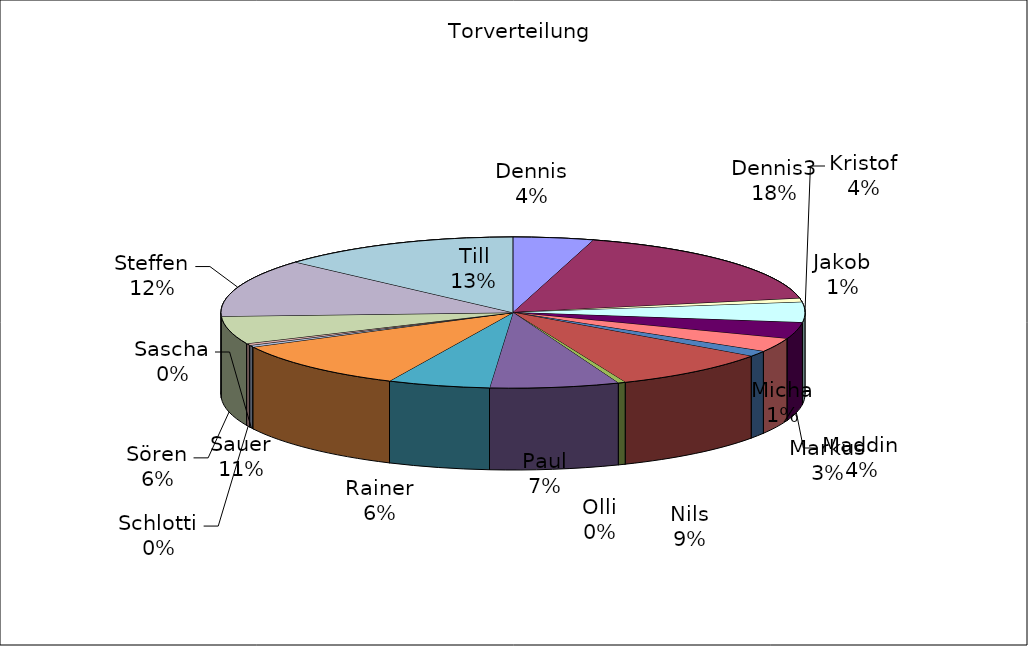
| Category | Series 0 |
|---|---|
| Dennis | 33 |
| Dennis3 | 130 |
| Jakob | 6 |
| Kristof | 32 |
| Maddin | 26 |
| Markus | 22 |
| Micha | 9 |
| Nils | 66 |
| Olli | 3 |
| Paul | 53 |
| Rainer | 42 |
| Sauer | 78 |
| Sascha | 3 |
| Schlotti | 3 |
| Sören | 44 |
| Steffen | 92 |
| Till | 99 |